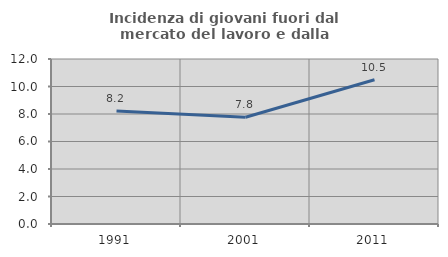
| Category | Incidenza di giovani fuori dal mercato del lavoro e dalla formazione  |
|---|---|
| 1991.0 | 8.225 |
| 2001.0 | 7.767 |
| 2011.0 | 10.491 |